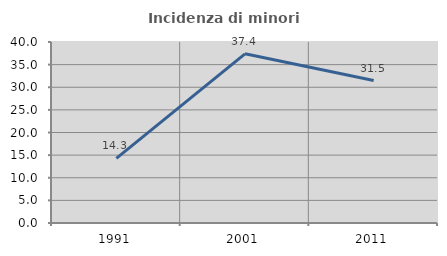
| Category | Incidenza di minori stranieri |
|---|---|
| 1991.0 | 14.286 |
| 2001.0 | 37.383 |
| 2011.0 | 31.492 |